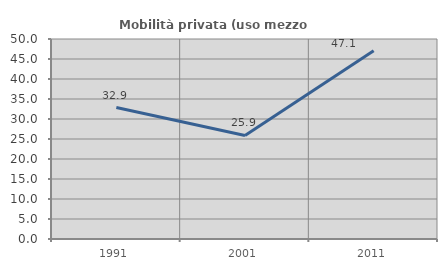
| Category | Mobilità privata (uso mezzo privato) |
|---|---|
| 1991.0 | 32.867 |
| 2001.0 | 25.882 |
| 2011.0 | 47.059 |